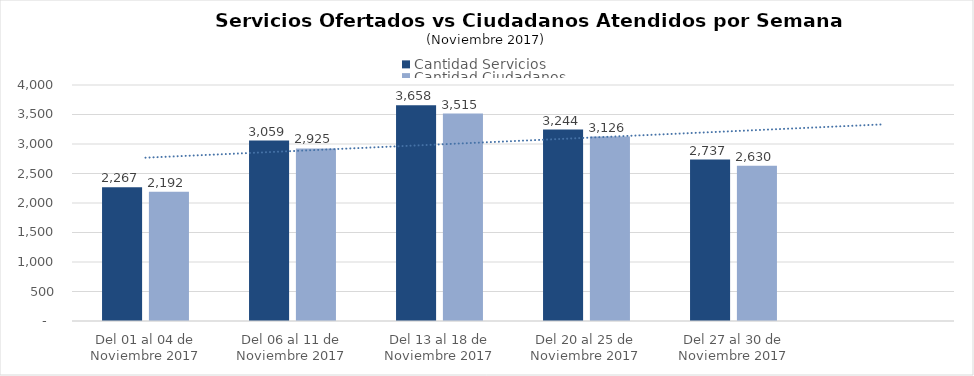
| Category | Cantidad Servicios | Cantidad Ciudadanos |
|---|---|---|
| Del 01 al 04 de Noviembre 2017 | 2267 | 2192 |
| Del 06 al 11 de Noviembre 2017 | 3059 | 2925 |
| Del 13 al 18 de Noviembre 2017 | 3658 | 3515 |
| Del 20 al 25 de Noviembre 2017 | 3244 | 3126 |
| Del 27 al 30 de Noviembre 2017 | 2737 | 2630 |